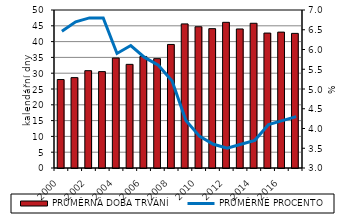
| Category | PRŮMĚRNÁ DOBA TRVÁNÍ |
|---|---|
| 2000.0 | 28 |
| 2001.0 | 28.6 |
| 2002.0 | 30.8 |
| 2003.0 | 30.5 |
| 2004.0 | 34.8 |
| 2005.0 | 32.8 |
| 2006.0 | 35.3 |
| 2007.0 | 34.6 |
| 2008.0 | 39.1 |
| 2009.0 | 45.6 |
| 2010.0 | 44.7 |
| 2011.0 | 44.1 |
| 2012.0 | 46.1 |
| 2013.0 | 44 |
| 2014.0 | 45.8 |
| 2015.0 | 42.7 |
| 2016.0 | 43 |
| 2017.0 | 42.6 |